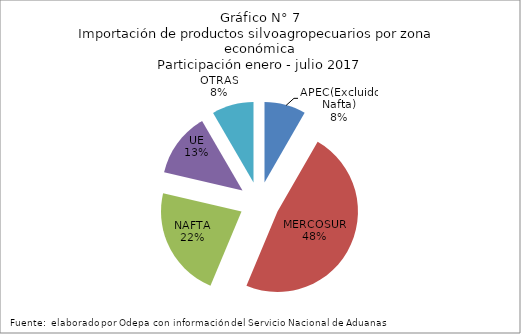
| Category | Series 0 |
|---|---|
| APEC(Excluido Nafta) | 269593.815 |
| MERCOSUR | 1555998.013 |
| NAFTA | 724330.627 |
| UE | 421149.065 |
| OTRAS | 271448.48 |